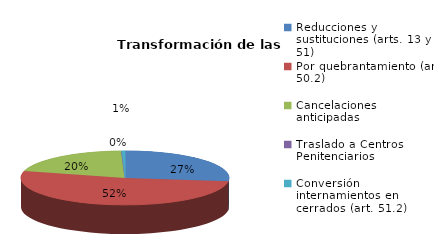
| Category | Series 0 |
|---|---|
| Reducciones y sustituciones (arts. 13 y 51) | 49 |
| Por quebrantamiento (art. 50.2) | 95 |
| Cancelaciones anticipadas | 37 |
| Traslado a Centros Penitenciarios | 0 |
| Conversión internamientos en cerrados (art. 51.2) | 1 |